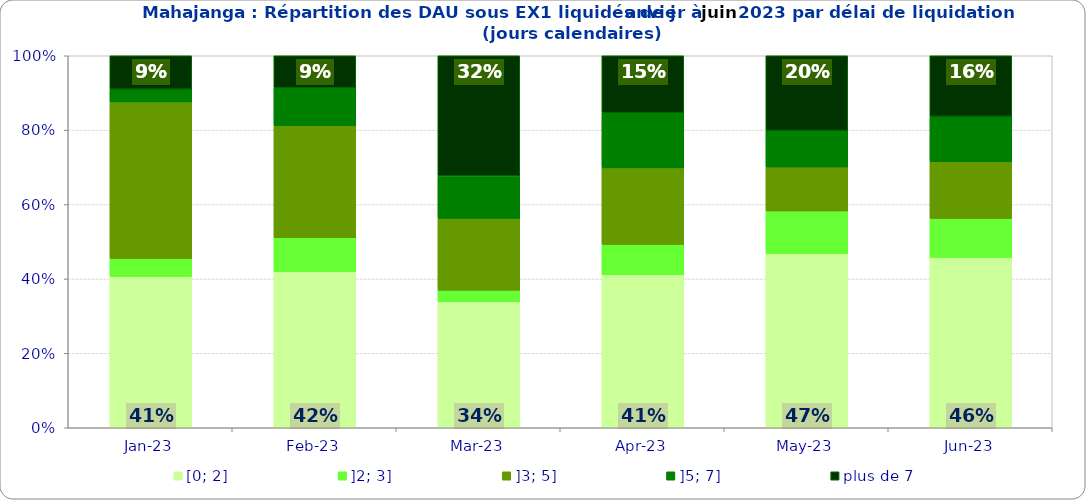
| Category | [0; 2] | ]2; 3] | ]3; 5] | ]5; 7] | plus de 7 |
|---|---|---|---|---|---|
| 2023-01-01 | 0.407 | 0.048 | 0.421 | 0.034 | 0.09 |
| 2023-02-01 | 0.419 | 0.091 | 0.301 | 0.102 | 0.086 |
| 2023-03-01 | 0.339 | 0.031 | 0.193 | 0.115 | 0.323 |
| 2023-04-01 | 0.411 | 0.081 | 0.206 | 0.148 | 0.153 |
| 2023-05-01 | 0.469 | 0.114 | 0.118 | 0.098 | 0.201 |
| 2023-06-01 | 0.458 | 0.105 | 0.153 | 0.122 | 0.163 |